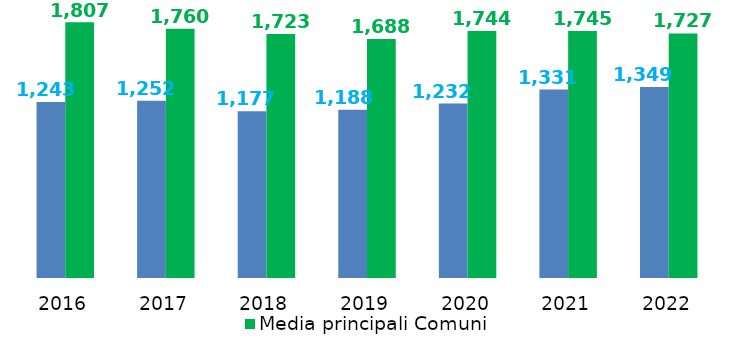
| Category | Indebitamento procapite | Media principali Comuni |
|---|---|---|
| 2016.0 | 1242.653 | 1806.715 |
| 2017.0 | 1252.237 | 1760.222 |
| 2018.0 | 1177.34 | 1723.431 |
| 2019.0 | 1188.12 | 1688.383 |
| 2020.0 | 1231.6 | 1744.019 |
| 2021.0 | 1330.624 | 1744.779 |
| 2022.0 | 1349.05 | 1726.956 |